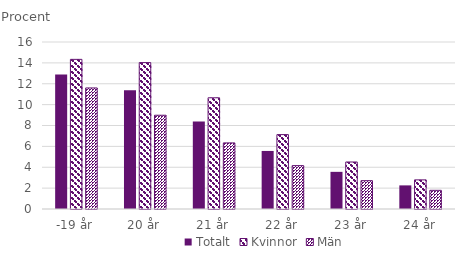
| Category | Totalt | Kvinnor | Män |
|---|---|---|---|
| -19 år | 12.892 | 14.337 | 11.598 |
| 20 år | 11.367 | 14.028 | 8.982 |
| 21 år | 8.375 | 10.655 | 6.333 |
| 22 år | 5.562 | 7.129 | 4.157 |
| 23 år | 3.559 | 4.503 | 2.713 |
| 24 år | 2.263 | 2.792 | 1.789 |